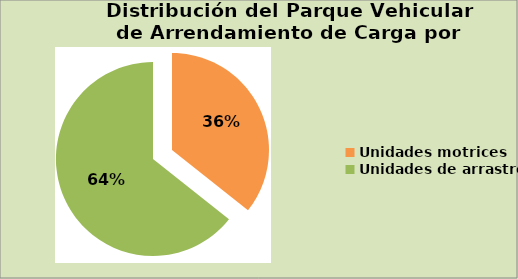
| Category | Series 0 |
|---|---|
| Unidades motrices | 35.673 |
| Unidades de arrastre | 64.327 |